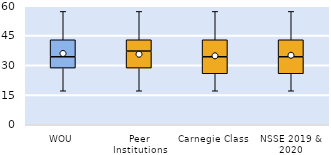
| Category | 25th | 50th | 75th |
|---|---|---|---|
| WOU | 28.571 | 5.714 | 8.571 |
| Peer Institutions | 28.571 | 8.571 | 5.714 |
| Carnegie Class | 25.714 | 8.571 | 8.571 |
| NSSE 2019 & 2020 | 25.714 | 8.571 | 8.571 |